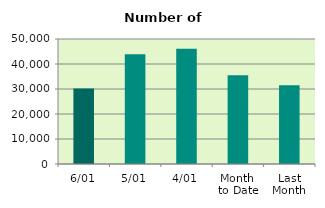
| Category | Series 0 |
|---|---|
| 6/01 | 30244 |
| 5/01 | 43912 |
| 4/01 | 46090 |
| Month 
to Date | 35547.2 |
| Last
Month | 31517.905 |